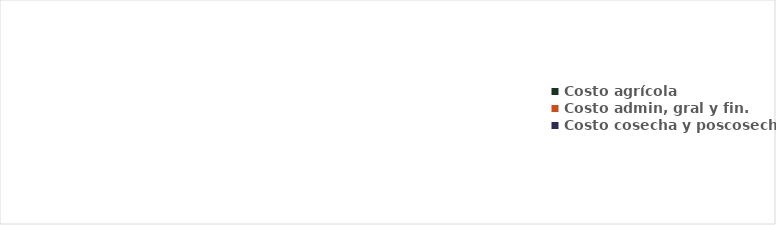
| Category | Series 0 |
|---|---|
| Costo agrícola | 0 |
| Costo admin, gral y fin. | 0 |
| Costo cosecha y poscosecha | 0 |